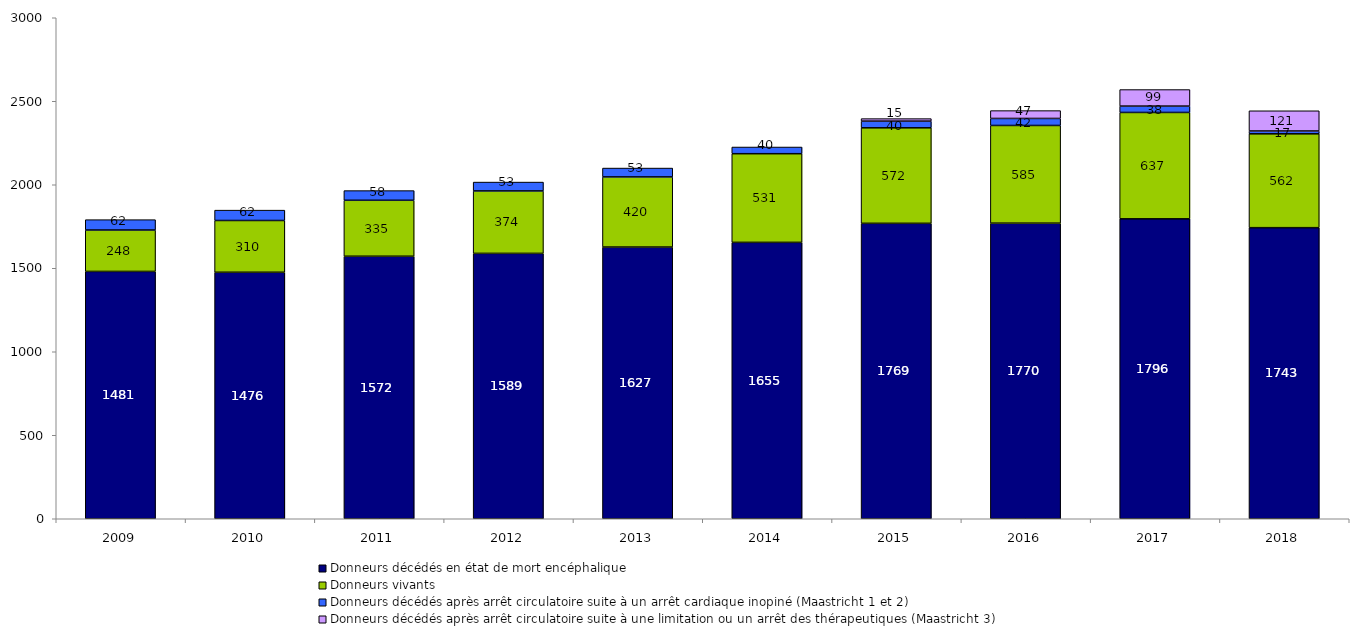
| Category | Donneurs décédés en état de mort encéphalique | Donneurs vivants | Donneurs décédés après arrêt circulatoire suite à un arrêt cardiaque inopiné (Maastricht 1 et 2) | Donneurs décédés après arrêt circulatoire suite à une limitation ou un arrêt des thérapeutiques (Maastricht 3) |
|---|---|---|---|---|
| 2009.0 | 1481 | 248 | 62 | 0 |
| 2010.0 | 1476 | 310 | 62 | 0 |
| 2011.0 | 1572 | 335 | 58 | 0 |
| 2012.0 | 1589 | 374 | 53 | 0 |
| 2013.0 | 1627 | 420 | 53 | 0 |
| 2014.0 | 1655 | 531 | 40 | 0 |
| 2015.0 | 1769 | 572 | 40 | 15 |
| 2016.0 | 1770 | 585 | 42 | 47 |
| 2017.0 | 1796 | 637 | 38 | 99 |
| 2018.0 | 1743 | 562 | 17 | 121 |